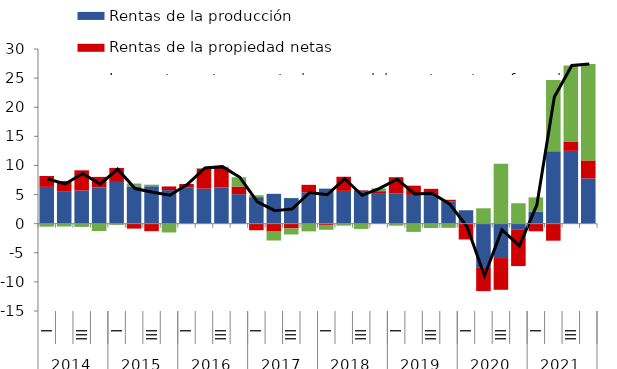
| Category | Rentas de la producción | Rentas de la propiedad netas | Impuestos netos, prestaciones sociales netas y transferencias corrientes netas (*) |
|---|---|---|---|
| 0 | 6.318 | 1.868 | -0.517 |
| 1 | 5.483 | 1.832 | -0.494 |
| 2 | 5.689 | 3.478 | -0.558 |
| 3 | 6.21 | 1.826 | -1.263 |
| 4 | 7.168 | 2.403 | -0.212 |
| 5 | 6.4 | -0.854 | 0.491 |
| 6 | 6.43 | -1.289 | 0.27 |
| 7 | 5.765 | 0.631 | -1.512 |
| 8 | 6.186 | 0.631 | -0.063 |
| 9 | 6.014 | 3.437 | 0.113 |
| 10 | 6.206 | 3.38 | 0.209 |
| 11 | 5.065 | 1.311 | 1.591 |
| 12 | 4.556 | -1.128 | 0.321 |
| 13 | 5.127 | -1.364 | -1.531 |
| 14 | 4.393 | -0.819 | -1.04 |
| 15 | 5.369 | 1.304 | -1.324 |
| 16 | 6.016 | -0.219 | -0.833 |
| 17 | 5.633 | 2.425 | -0.336 |
| 18 | 5.685 | 0.079 | -0.902 |
| 19 | 5.258 | 0.324 | 0.472 |
| 20 | 5.165 | 2.813 | -0.343 |
| 21 | 4.942 | 1.585 | -1.42 |
| 22 | 4.742 | 1.244 | -0.749 |
| 23 | 3.847 | 0.256 | -0.716 |
| 24 | 2.304 | -2.683 | -0.124 |
| 25 | -7.594 | -3.996 | 2.643 |
| 26 | -5.911 | -5.444 | 10.29 |
| 27 | -0.97 | -6.312 | 3.506 |
| 28 | 2.07 | -1.307 | 2.449 |
| 29 | 12.456 | -2.924 | 12.223 |
| 30 | 12.512 | 1.605 | 13.042 |
| 31 | 7.778 | 3.083 | 16.563 |